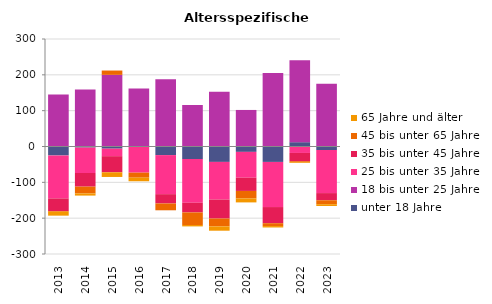
| Category | unter 18 Jahre | 18 bis unter 25 Jahre | 25 bis unter 35 Jahre | 35 bis unter 45 Jahre | 45 bis unter 65 Jahre | 65 Jahre und älter |
|---|---|---|---|---|---|---|
| 2013.0 | -25 | 145 | -120 | -35 | -2 | -11 |
| 2014.0 | -3 | 159 | -71 | -38 | -19 | -6 |
| 2015.0 | -6 | 200 | -21 | -45 | 12 | -13 |
| 2016.0 | 0 | 162 | -73 | 0 | -14 | -10 |
| 2017.0 | -24 | 188 | -109 | -26 | -19 | 0 |
| 2018.0 | -35 | 116 | -122 | -27 | -35 | -4 |
| 2019.0 | -43 | 153 | -105 | -53 | -22 | -12 |
| 2020.0 | -15 | 102 | -72 | -37 | -21 | -11 |
| 2021.0 | -43 | 205 | -126 | -45 | -8 | -4 |
| 2022.0 | 12 | 229 | -18 | -23 | -3 | -2 |
| 2023.0 | -10 | 175 | -120 | -20 | -11 | -5 |